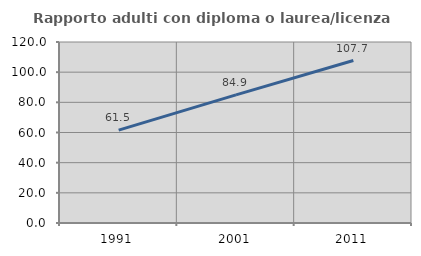
| Category | Rapporto adulti con diploma o laurea/licenza media  |
|---|---|
| 1991.0 | 61.538 |
| 2001.0 | 84.925 |
| 2011.0 | 107.729 |